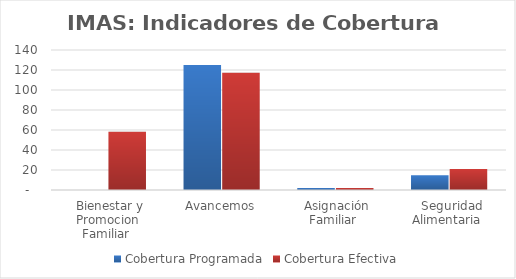
| Category | Cobertura Programada | Cobertura Efectiva |
|---|---|---|
| Bienestar y Promocion Familiar | 0 | 58.266 |
| Avancemos | 125.108 | 117.163 |
| Asignación Familiar | 1.916 | 1.954 |
| Seguridad Alimentaria | 14.677 | 20.898 |